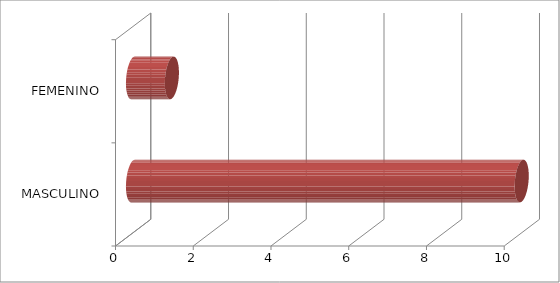
| Category | Series 0 |
|---|---|
| MASCULINO | 10 |
| FEMENINO | 1 |